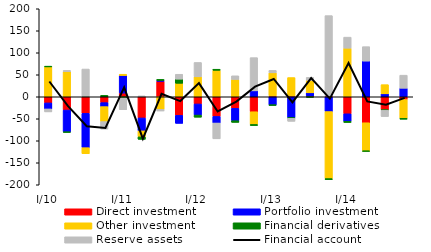
| Category | Direct investment | Portfolio investment | Other investment | Financial derivatives | Reserve assets |
|---|---|---|---|---|---|
| I/10 | -13.934 | -13.635 | 67.89 | 1.747 | -6.812 |
| II | -30.165 | -49.571 | 56.854 | -1.202 | 3.148 |
| III | -37.641 | -78.052 | -13.851 | 1.002 | 62.09 |
| IV | -13.25 | -9.095 | -34.061 | 3.2 | -17.001 |
| I/11 | 8.394 | 39.909 | 2.964 | -2.567 | -26.789 |
| II | -48.128 | -29.388 | -13.604 | -5.635 | 2.123 |
| III | 35.202 | 1.853 | -28.649 | 2.491 | -3.698 |
| IV | -42.273 | -18.154 | 30.668 | 9.385 | 11.134 |
| I/12 | -16.29 | -25.293 | 45.36 | -4.87 | 32.632 |
| II | -44.641 | -14.957 | 60.168 | 2.453 | -35.982 |
| III | -26.334 | -28.062 | 39.368 | -3.806 | 8.321 |
| IV | -33.997 | 13.465 | -28.955 | -2.395 | 75.502 |
| I/13 | 1.859 | -18.95 | 52.574 | -0.086 | 5.61 |
| II | 1.859 | -47.44 | 41.851 | -1.44 | -6.912 |
| III | 1.859 | 7.148 | 28.263 | -1.061 | 6.889 |
| IV | 1.859 | -33.596 | -152.434 | -2.15 | 182.604 |
| I/14 | -38.685 | -16.995 | 110.469 | -2.764 | 25.08 |
| II | -59.028 | 81.147 | -64.302 | -0.503 | 32.776 |
| III | -29.662 | 6.715 | 20.861 | -0.818 | -14.448 |
| IV | -6.258 | 19.403 | -42.777 | -1.962 | 29.714 |